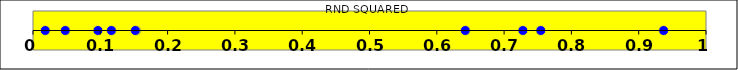
| Category | RND SQUARED |
|---|---|
| 0.7545185228002905 | 0 |
| 0.09648867428255932 | 0 |
| 0.15346418209789933 | 0 |
| 0.7278944990723675 | 0 |
| 0.15210116271040852 | 0 |
| 0.11651327800630565 | 0 |
| 0.937015997485612 | 0 |
| 0.018168965013724295 | 0 |
| 0.6423305667718635 | 0 |
| 0.04793848207693474 | 0 |